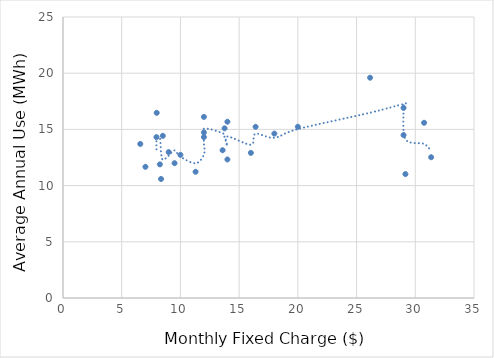
| Category | MWh/customer |
|---|---|
| 31.35 | 12.525 |
| 30.75 | 15.588 |
| 29.16 | 11.024 |
| 29.0 | 16.917 |
| 29.0 | 14.498 |
| 26.15 | 19.598 |
| 20.0 | 15.234 |
| 18.0 | 14.624 |
| 16.4 | 15.229 |
| 16.0 | 12.91 |
| 14.0 | 12.326 |
| 14.0 | 15.683 |
| 13.76 | 15.093 |
| 13.59 | 13.147 |
| 12.0 | 14.317 |
| 12.0 | 16.112 |
| 12.0 | 14.729 |
| 11.29 | 11.23 |
| 10.0 | 12.737 |
| 9.5 | 11.993 |
| 9.0 | 12.978 |
| 8.5 | 14.427 |
| 8.35 | 10.589 |
| 8.25 | 11.889 |
| 7.98 | 16.474 |
| 7.96 | 14.312 |
| 7.02 | 11.672 |
| 6.58 | 13.706 |